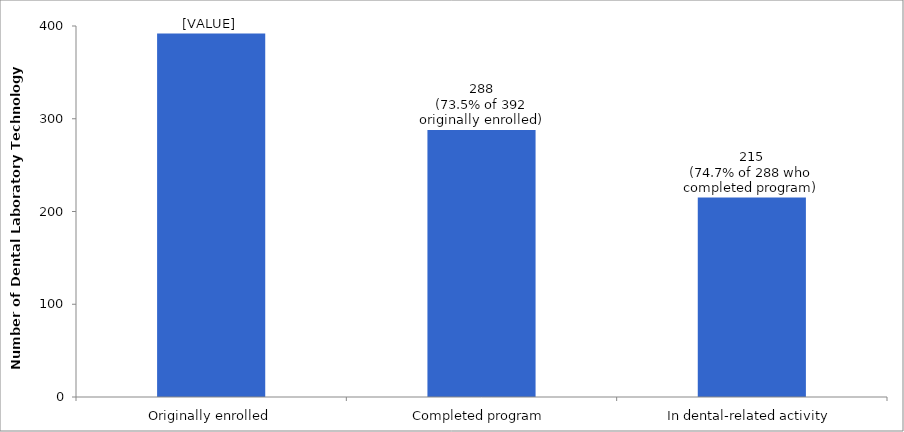
| Category | Series 0 |
|---|---|
| Originally enrolled | 392 |
| Completed program | 288 |
| In dental-related activity | 215 |